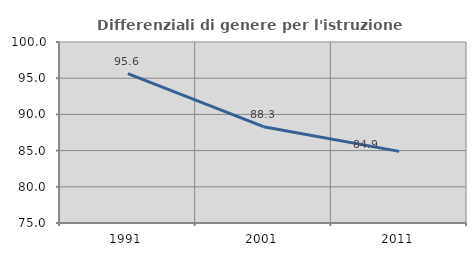
| Category | Differenziali di genere per l'istruzione superiore |
|---|---|
| 1991.0 | 95.643 |
| 2001.0 | 88.308 |
| 2011.0 | 84.894 |